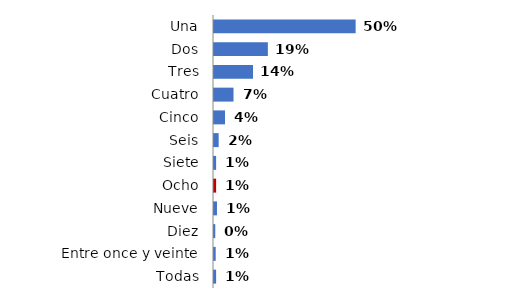
| Category | Series 0 |
|---|---|
| Una | 0.502 |
| Dos | 0.191 |
| Tres | 0.138 |
| Cuatro | 0.069 |
| Cinco | 0.039 |
| Seis | 0.017 |
| Siete | 0.008 |
| Ocho | 0.008 |
| Nueve | 0.011 |
| Diez | 0.005 |
| Entre once y veinte | 0.006 |
| Todas | 0.008 |